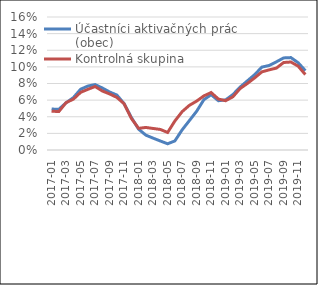
| Category | Účastníci aktivačných prác (obec) | Kontrolná skupina |
|---|---|---|
| 2017-01 | 0.049 | 0.047 |
| 2017-02 | 0.049 | 0.046 |
| 2017-03 | 0.057 | 0.057 |
| 2017-04 | 0.063 | 0.061 |
| 2017-05 | 0.073 | 0.069 |
| 2017-06 | 0.077 | 0.073 |
| 2017-07 | 0.079 | 0.076 |
| 2017-08 | 0.075 | 0.071 |
| 2017-09 | 0.07 | 0.067 |
| 2017-10 | 0.066 | 0.063 |
| 2017-11 | 0.056 | 0.056 |
| 2017-12 | 0.039 | 0.038 |
| 2018-01 | 0.025 | 0.026 |
| 2018-02 | 0.018 | 0.027 |
| 2018-03 | 0.014 | 0.026 |
| 2018-04 | 0.011 | 0.025 |
| 2018-05 | 0.007 | 0.021 |
| 2018-06 | 0.011 | 0.035 |
| 2018-07 | 0.024 | 0.046 |
| 2018-08 | 0.035 | 0.054 |
| 2018-09 | 0.047 | 0.059 |
| 2018-10 | 0.061 | 0.065 |
| 2018-11 | 0.067 | 0.069 |
| 2018-12 | 0.059 | 0.061 |
| 2019-01 | 0.06 | 0.059 |
| 2019-02 | 0.067 | 0.064 |
| 2019-03 | 0.076 | 0.074 |
| 2019-04 | 0.083 | 0.08 |
| 2019-05 | 0.091 | 0.087 |
| 2019-06 | 0.1 | 0.094 |
| 2019-07 | 0.102 | 0.096 |
| 2019-08 | 0.106 | 0.099 |
| 2019-09 | 0.111 | 0.105 |
| 2019-10 | 0.111 | 0.106 |
| 2019-11 | 0.105 | 0.101 |
| 2019-12 | 0.095 | 0.091 |